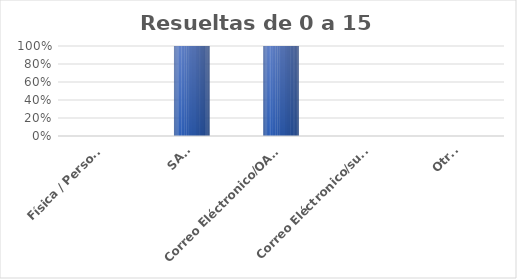
| Category | Series 0 |
|---|---|
| Física / Personal | 0 |
| SAIP | 1 |
| Correo Eléctronico/OAI/Info/Contacto | 7 |
| Correo Eléctronico/sugerencias | 0 |
| Otras | 0 |